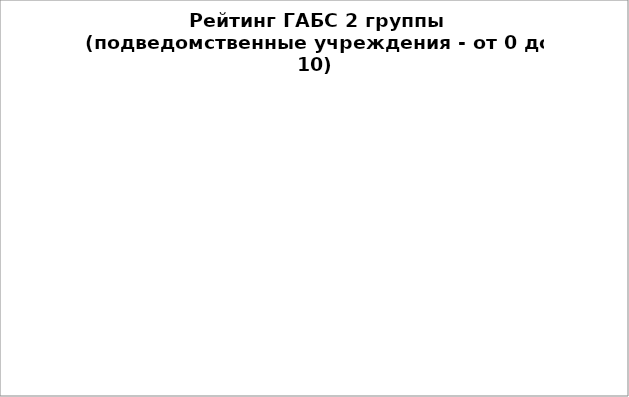
| Category | Series 0 |
|---|---|
| Департамент архитектуры и градостроительства Администрации города Омска | 98.539 |
| Департамент жилищной политики Администрации города Омска | 94.285 |
| Управление делами Администрации города Омска | 93.441 |
| Департамент городского хозяйства Администрации города Омска | 91.966 |
| Департамент имущественных отношений Администрации города Омска | 89.271 |